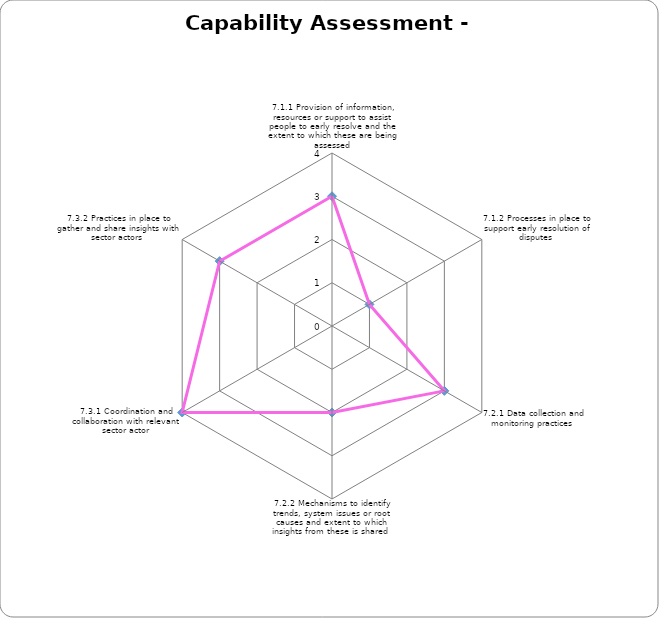
| Category | Series 0 |
|---|---|
| 7.1.1 Provision of information, resources or support to assist people to early resolve and the extent to which these are being assessed | 3 |
| 7.1.2 Processes in place to support early resolution of disputes  | 1 |
| 7.2.1 Data collection and monitoring practices  | 3 |
| 7.2.2 Mechanisms to identify trends, system issues or root causes and extent to which insights from these is shared  | 2 |
| 7.3.1 Coordination and collaboration with relevant sector actor | 4 |
| 7.3.2 Practices in place to gather and share insights with sector actors  | 3 |